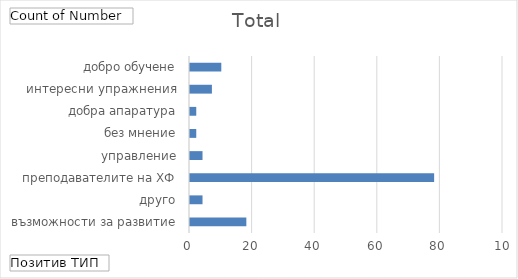
| Category | Total |
|---|---|
| възможности за развитие | 18 |
| друго | 4 |
| преподавателите на ХФ | 78 |
| управление | 4 |
| без мнение | 2 |
| добра апаратура | 2 |
| интересни упражнения | 7 |
| добро обучене | 10 |